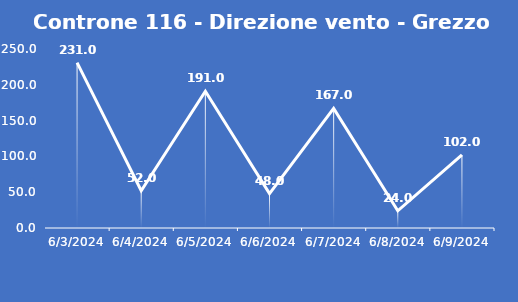
| Category | Controne 116 - Direzione vento - Grezzo (°N) |
|---|---|
| 6/3/24 | 231 |
| 6/4/24 | 52 |
| 6/5/24 | 191 |
| 6/6/24 | 48 |
| 6/7/24 | 167 |
| 6/8/24 | 24 |
| 6/9/24 | 102 |